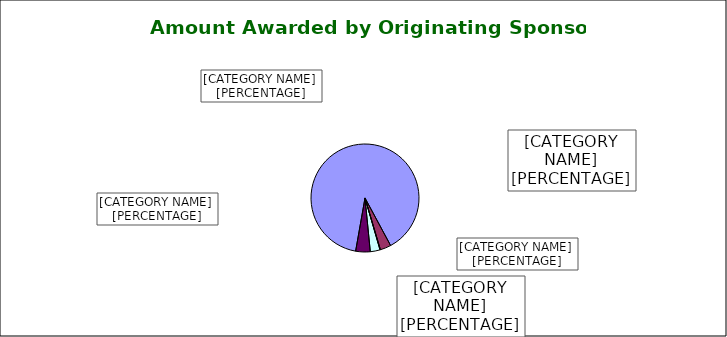
| Category | Series 0 |
|---|---|
| Federal $191.3M / | 0.894 |
| State of Vermont $7.0M / | 0.032 |
| Other State and Local Govt $0.3M / | 0.001 |
| Industry $6.2M / | 0.029 |
| Foundation and Non Profit $9.3M / | 0.043 |